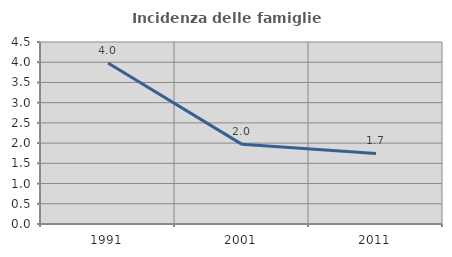
| Category | Incidenza delle famiglie numerose |
|---|---|
| 1991.0 | 3.981 |
| 2001.0 | 1.969 |
| 2011.0 | 1.743 |